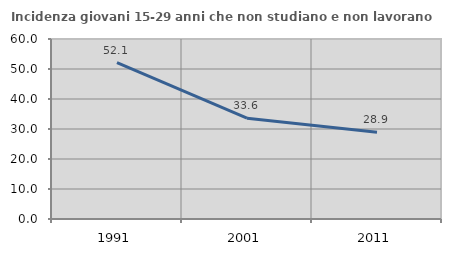
| Category | Incidenza giovani 15-29 anni che non studiano e non lavorano  |
|---|---|
| 1991.0 | 52.11 |
| 2001.0 | 33.613 |
| 2011.0 | 28.947 |